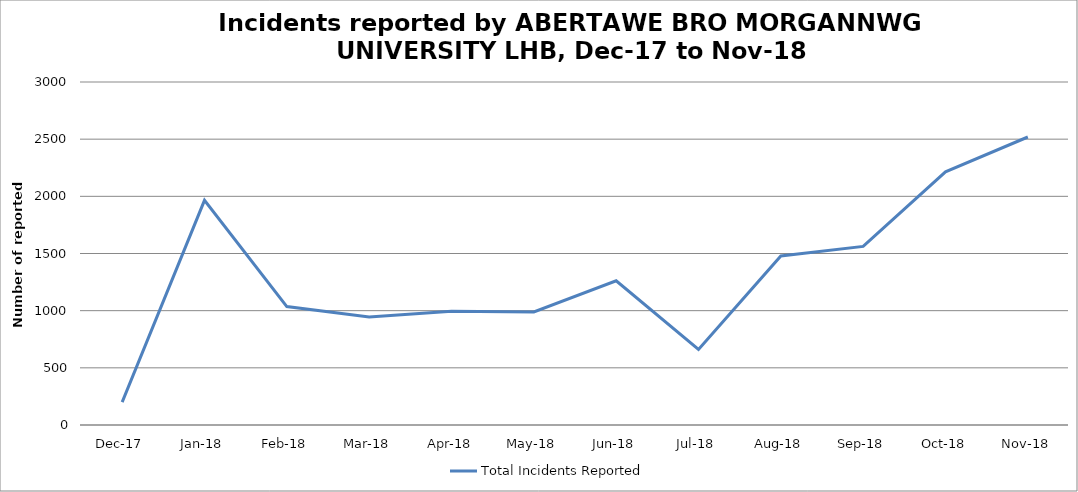
| Category | Total Incidents Reported |
|---|---|
| Dec-17 | 200 |
| Jan-18 | 1965 |
| Feb-18 | 1036 |
| Mar-18 | 945 |
| Apr-18 | 994 |
| May-18 | 989 |
| Jun-18 | 1261 |
| Jul-18 | 661 |
| Aug-18 | 1479 |
| Sep-18 | 1562 |
| Oct-18 | 2214 |
| Nov-18 | 2519 |